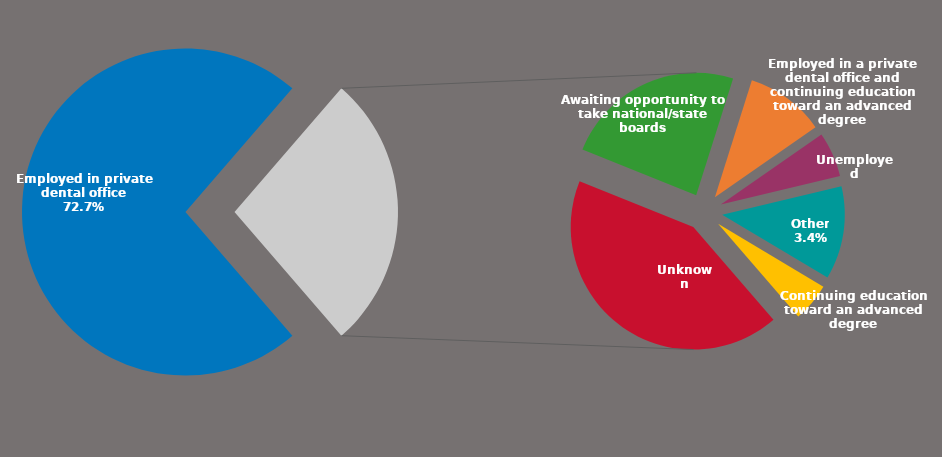
| Category | Series 0 |
|---|---|
| Employed in private dental office | 0.727 |
| Unknown | 0.116 |
| Awaiting opportunity to take national/state boards | 0.065 |
| Employed in a private dental office and continuing education toward an advanced degree | 0.029 |
| Unemployed | 0.016 |
| Other | 0.034 |
| Continuing education toward an advanced degree | 0.014 |